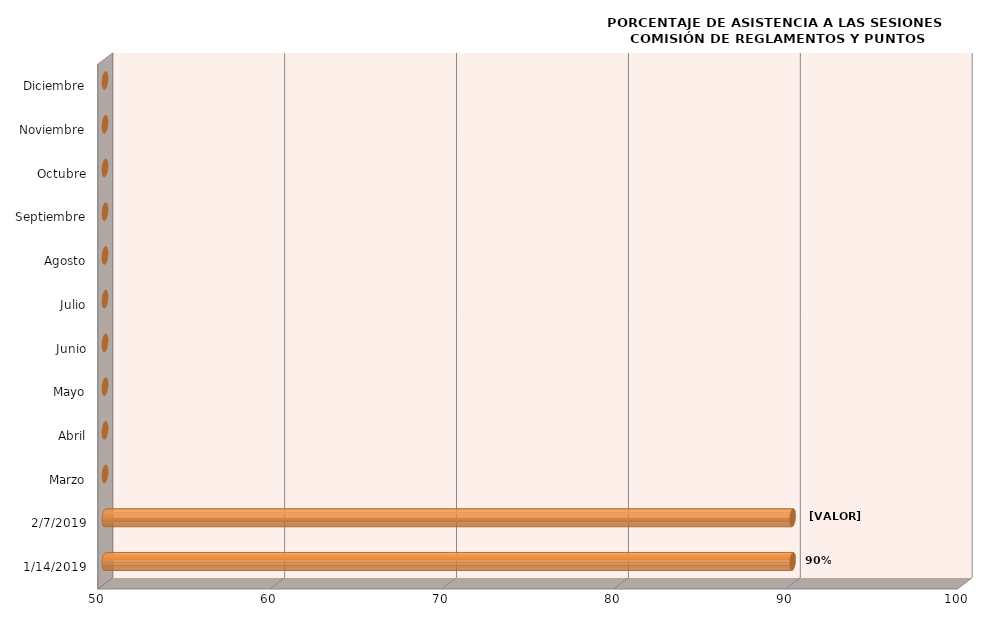
| Category | Series 0 |
|---|---|
| 14/01/2019 | 90 |
| 07/02/2019 | 90 |
| Marzo | 0 |
| Abril | 0 |
| Mayo | 0 |
| Junio | 0 |
| Julio | 0 |
| Agosto | 0 |
| Septiembre | 0 |
| Octubre | 0 |
| Noviembre | 0 |
| Diciembre | 0 |